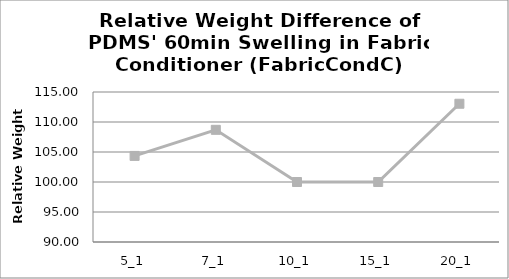
| Category | Relative weight (%) |
|---|---|
| 5_1 | 104.348 |
| 7_1 | 108.696 |
| 10_1 | 100 |
| 15_1 | 100 |
| 20_1 | 113.043 |